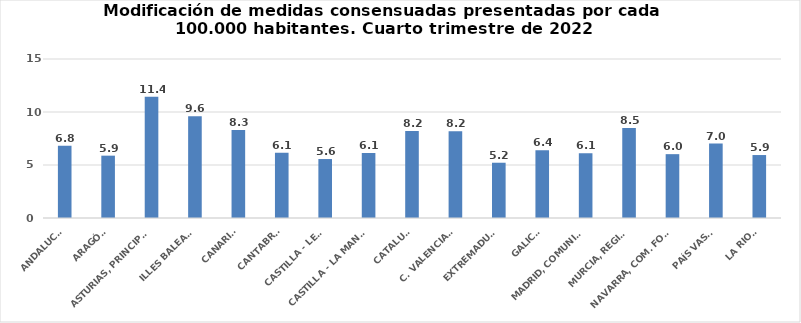
| Category | Series 0 |
|---|---|
| ANDALUCÍA | 6.806 |
| ARAGÓN | 5.881 |
| ASTURIAS, PRINCIPADO | 11.446 |
| ILLES BALEARS | 9.603 |
| CANARIAS | 8.312 |
| CANTABRIA | 6.15 |
| CASTILLA - LEÓN | 5.563 |
| CASTILLA - LA MANCHA | 6.136 |
| CATALUÑA | 8.213 |
| C. VALENCIANA | 8.18 |
| EXTREMADURA | 5.214 |
| GALICIA | 6.393 |
| MADRID, COMUNIDAD | 6.118 |
| MURCIA, REGIÓN | 8.486 |
| NAVARRA, COM. FORAL | 6.023 |
| PAÍS VASCO | 7.019 |
| LA RIOJA | 5.94 |